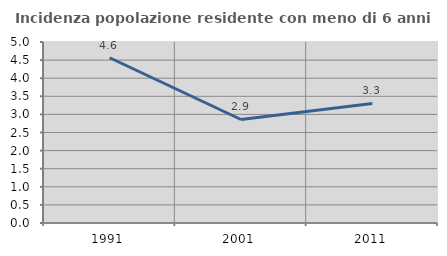
| Category | Incidenza popolazione residente con meno di 6 anni |
|---|---|
| 1991.0 | 4.565 |
| 2001.0 | 2.859 |
| 2011.0 | 3.302 |